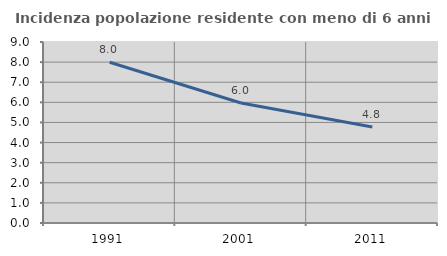
| Category | Incidenza popolazione residente con meno di 6 anni |
|---|---|
| 1991.0 | 7.991 |
| 2001.0 | 5.968 |
| 2011.0 | 4.776 |